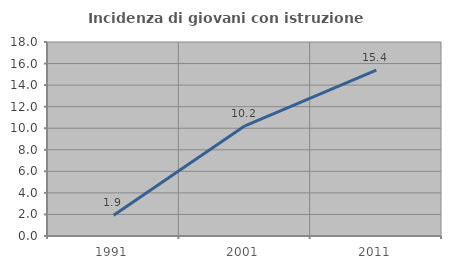
| Category | Incidenza di giovani con istruzione universitaria |
|---|---|
| 1991.0 | 1.923 |
| 2001.0 | 10.222 |
| 2011.0 | 15.399 |